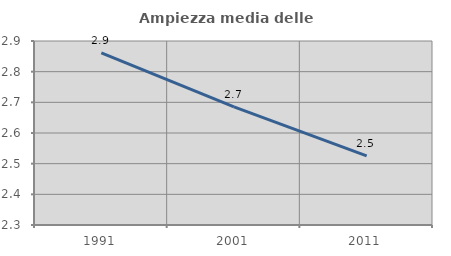
| Category | Ampiezza media delle famiglie |
|---|---|
| 1991.0 | 2.861 |
| 2001.0 | 2.685 |
| 2011.0 | 2.525 |